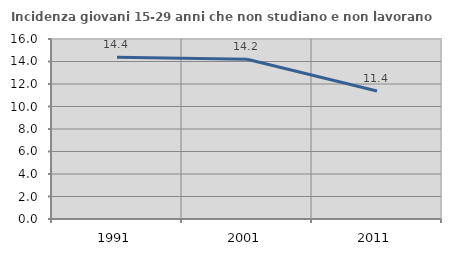
| Category | Incidenza giovani 15-29 anni che non studiano e non lavorano  |
|---|---|
| 1991.0 | 14.388 |
| 2001.0 | 14.201 |
| 2011.0 | 11.382 |